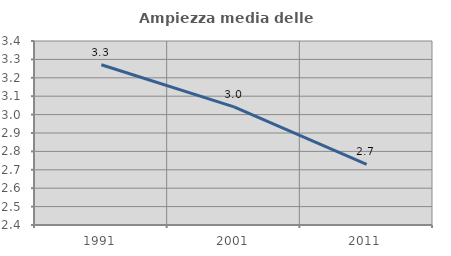
| Category | Ampiezza media delle famiglie |
|---|---|
| 1991.0 | 3.271 |
| 2001.0 | 3.042 |
| 2011.0 | 2.729 |